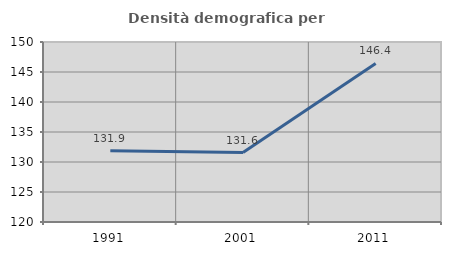
| Category | Densità demografica |
|---|---|
| 1991.0 | 131.887 |
| 2001.0 | 131.571 |
| 2011.0 | 146.436 |